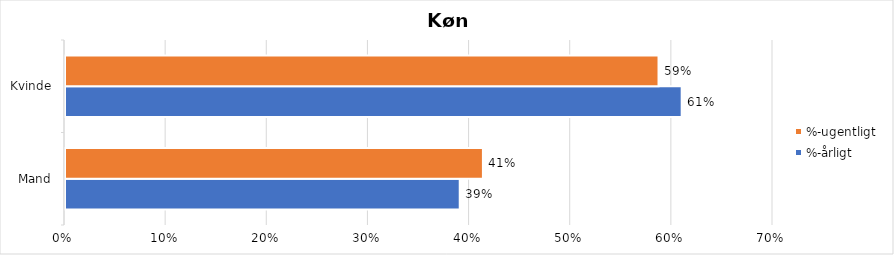
| Category | %-årligt | %-ugentligt |
|---|---|---|
| Mand | 0.39 | 0.413 |
| Kvinde | 0.61 | 0.587 |